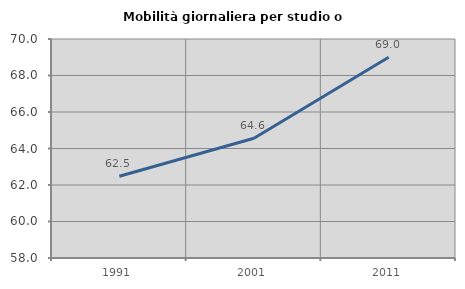
| Category | Mobilità giornaliera per studio o lavoro |
|---|---|
| 1991.0 | 62.48 |
| 2001.0 | 64.562 |
| 2011.0 | 69 |